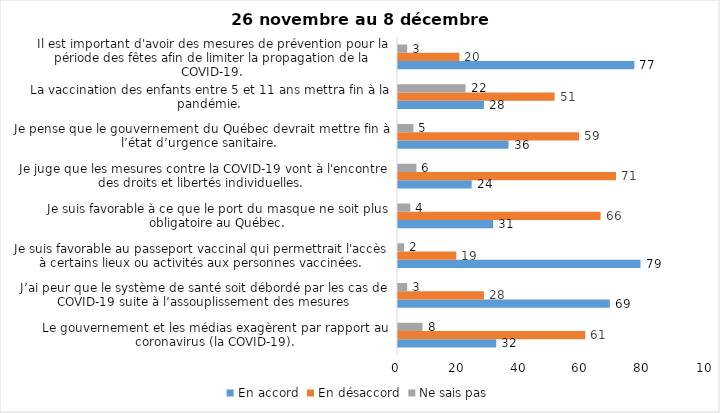
| Category | En accord | En désaccord | Ne sais pas |
|---|---|---|---|
| Le gouvernement et les médias exagèrent par rapport au coronavirus (la COVID-19). | 32 | 61 | 8 |
| J’ai peur que le système de santé soit débordé par les cas de COVID-19 suite à l’assouplissement des mesures | 69 | 28 | 3 |
| Je suis favorable au passeport vaccinal qui permettrait l'accès à certains lieux ou activités aux personnes vaccinées. | 79 | 19 | 2 |
| Je suis favorable à ce que le port du masque ne soit plus obligatoire au Québec. | 31 | 66 | 4 |
| Je juge que les mesures contre la COVID-19 vont à l'encontre des droits et libertés individuelles.  | 24 | 71 | 6 |
| Je pense que le gouvernement du Québec devrait mettre fin à l’état d’urgence sanitaire.  | 36 | 59 | 5 |
| La vaccination des enfants entre 5 et 11 ans mettra fin à la pandémie. | 28 | 51 | 22 |
| Il est important d'avoir des mesures de prévention pour la période des fêtes afin de limiter la propagation de la COVID-19. | 77 | 20 | 3 |